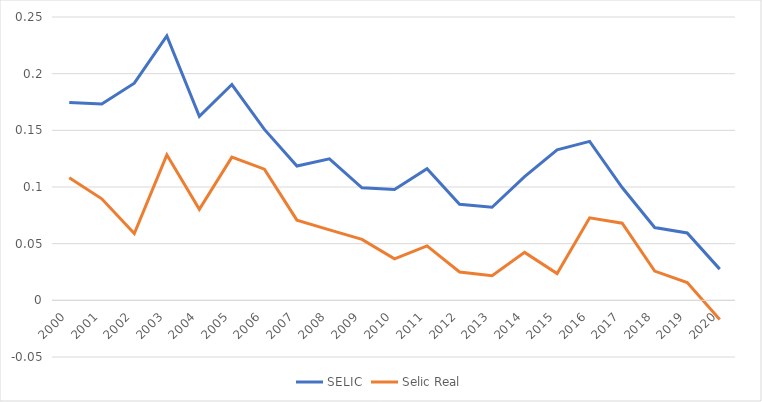
| Category | SELIC | Selic Real |
|---|---|---|
| 2000.0 | 0.174 | 0.108 |
| 2001.0 | 0.173 | 0.09 |
| 2002.0 | 0.192 | 0.059 |
| 2003.0 | 0.233 | 0.128 |
| 2004.0 | 0.162 | 0.08 |
| 2005.0 | 0.19 | 0.126 |
| 2006.0 | 0.151 | 0.116 |
| 2007.0 | 0.118 | 0.071 |
| 2008.0 | 0.125 | 0.062 |
| 2009.0 | 0.099 | 0.054 |
| 2010.0 | 0.098 | 0.037 |
| 2011.0 | 0.116 | 0.048 |
| 2012.0 | 0.085 | 0.025 |
| 2013.0 | 0.082 | 0.022 |
| 2014.0 | 0.109 | 0.042 |
| 2015.0 | 0.133 | 0.024 |
| 2016.0 | 0.14 | 0.073 |
| 2017.0 | 0.1 | 0.068 |
| 2018.0 | 0.064 | 0.026 |
| 2019.0 | 0.059 | 0.016 |
| 2020.0 | 0.028 | -0.017 |